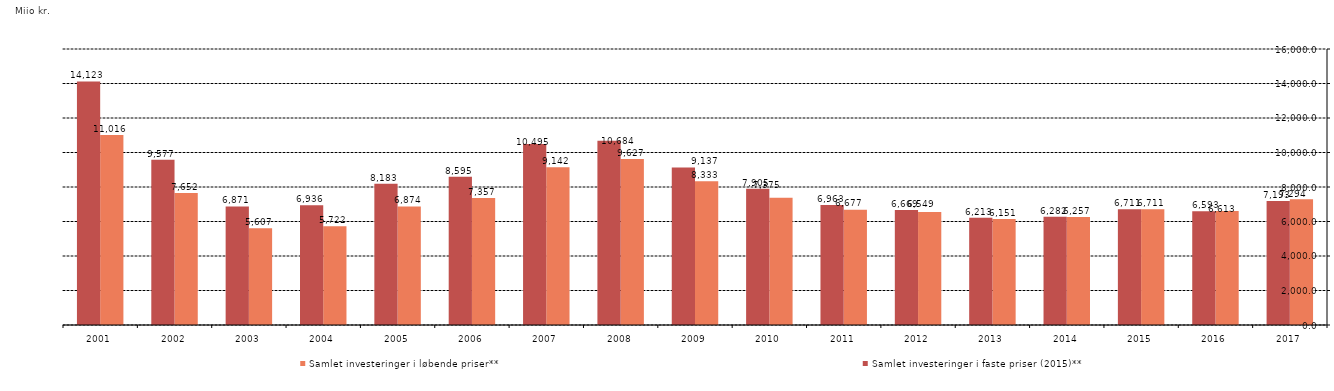
| Category | Samlet investeringer i løbende priser** | Samlet investeringer i faste priser (2015)** |
|---|---|---|
| 2017.0 | 7293.551 | 7192.851 |
| 2016.0 | 6612.512 | 6592.734 |
| 2015.0 | 6711.477 | 6711.477 |
| 2014.0 | 6256.567 | 6281.693 |
| 2013.0 | 6150.937 | 6213.068 |
| 2012.0 | 6548.757 | 6668.795 |
| 2011.0 | 6677.383 | 6962.861 |
| 2010.0 | 7375.125 | 7904.743 |
| 2009.0 | 8332.907 | 9136.96 |
| 2008.0 | 9626.581 | 10684.329 |
| 2007.0 | 9142 | 10494.834 |
| 2006.0 | 7357 | 8594.626 |
| 2005.0 | 6874 | 8183.333 |
| 2004.0 | 5722 | 6935.758 |
| 2003.0 | 5607 | 6871.324 |
| 2002.0 | 7652 | 9576.971 |
| 2001.0 | 11016 | 14123.077 |